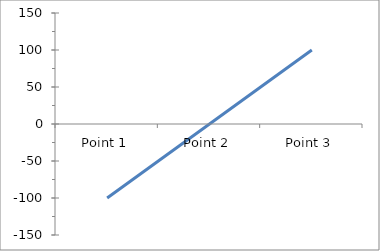
| Category | Series 4 |
|---|---|
| Point 1 | -100 |
| Point 2 | 0 |
| Point 3 | 100 |